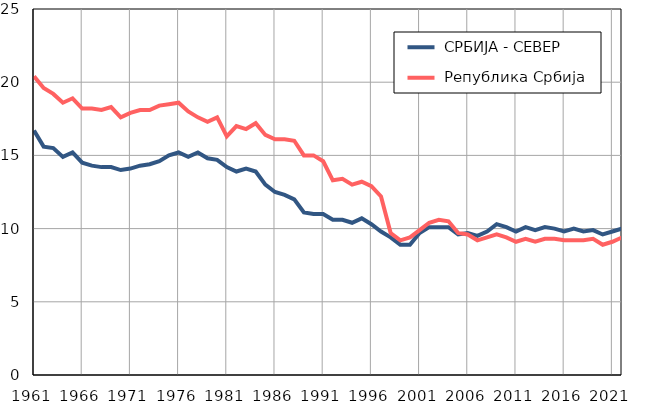
| Category |  СРБИЈА - СЕВЕР |  Република Србија |
|---|---|---|
| 1961.0 | 16.7 | 20.4 |
| 1962.0 | 15.6 | 19.6 |
| 1963.0 | 15.5 | 19.2 |
| 1964.0 | 14.9 | 18.6 |
| 1965.0 | 15.2 | 18.9 |
| 1966.0 | 14.5 | 18.2 |
| 1967.0 | 14.3 | 18.2 |
| 1968.0 | 14.2 | 18.1 |
| 1969.0 | 14.2 | 18.3 |
| 1970.0 | 14 | 17.6 |
| 1971.0 | 14.1 | 17.9 |
| 1972.0 | 14.3 | 18.1 |
| 1973.0 | 14.4 | 18.1 |
| 1974.0 | 14.6 | 18.4 |
| 1975.0 | 15 | 18.5 |
| 1976.0 | 15.2 | 18.6 |
| 1977.0 | 14.9 | 18 |
| 1978.0 | 15.2 | 17.6 |
| 1979.0 | 14.8 | 17.3 |
| 1980.0 | 14.7 | 17.6 |
| 1981.0 | 14.2 | 16.3 |
| 1982.0 | 13.9 | 17 |
| 1983.0 | 14.1 | 16.8 |
| 1984.0 | 13.9 | 17.2 |
| 1985.0 | 13 | 16.4 |
| 1986.0 | 12.5 | 16.1 |
| 1987.0 | 12.3 | 16.1 |
| 1988.0 | 12 | 16 |
| 1989.0 | 11.1 | 15 |
| 1990.0 | 11 | 15 |
| 1991.0 | 11 | 14.6 |
| 1992.0 | 10.6 | 13.3 |
| 1993.0 | 10.6 | 13.4 |
| 1994.0 | 10.4 | 13 |
| 1995.0 | 10.7 | 13.2 |
| 1996.0 | 10.3 | 12.9 |
| 1997.0 | 9.8 | 12.2 |
| 1998.0 | 9.4 | 9.7 |
| 1999.0 | 8.9 | 9.2 |
| 2000.0 | 8.9 | 9.4 |
| 2001.0 | 9.7 | 9.9 |
| 2002.0 | 10.1 | 10.4 |
| 2003.0 | 10.1 | 10.6 |
| 2004.0 | 10.1 | 10.5 |
| 2005.0 | 9.6 | 9.7 |
| 2006.0 | 9.7 | 9.6 |
| 2007.0 | 9.5 | 9.2 |
| 2008.0 | 9.8 | 9.4 |
| 2009.0 | 10.3 | 9.6 |
| 2010.0 | 10.1 | 9.4 |
| 2011.0 | 9.8 | 9.1 |
| 2012.0 | 10.1 | 9.3 |
| 2013.0 | 9.9 | 9.1 |
| 2014.0 | 10.1 | 9.3 |
| 2015.0 | 10 | 9.3 |
| 2016.0 | 9.8 | 9.2 |
| 2017.0 | 10 | 9.2 |
| 2018.0 | 9.8 | 9.2 |
| 2019.0 | 9.9 | 9.3 |
| 2020.0 | 9.6 | 8.9 |
| 2021.0 | 9.8 | 9.1 |
| 2022.0 | 10 | 9.4 |